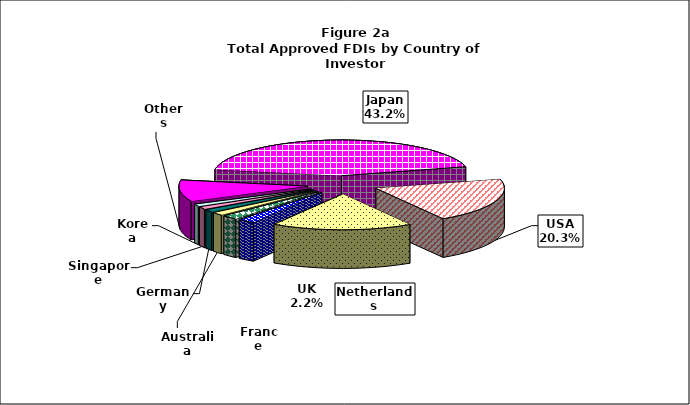
| Category | Series 0 |
|---|---|
| Japan | 0.432 |
| USA | 0.203 |
| Netherlands | 0.177 |
| UK | 0.022 |
| France | 0.02 |
| Australia | 0.015 |
| Germany | 0.012 |
| Singapore | 0.012 |
| Korea | 0.01 |
| Others | 0.097 |